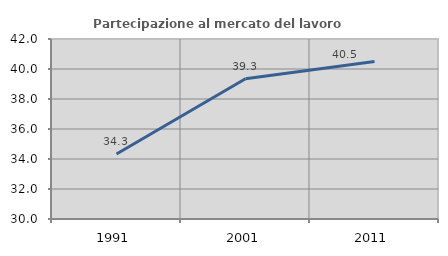
| Category | Partecipazione al mercato del lavoro  femminile |
|---|---|
| 1991.0 | 34.33 |
| 2001.0 | 39.347 |
| 2011.0 | 40.506 |